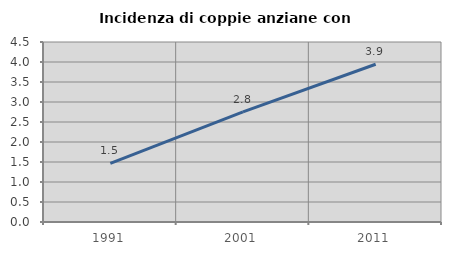
| Category | Incidenza di coppie anziane con figli |
|---|---|
| 1991.0 | 1.465 |
| 2001.0 | 2.751 |
| 2011.0 | 3.944 |